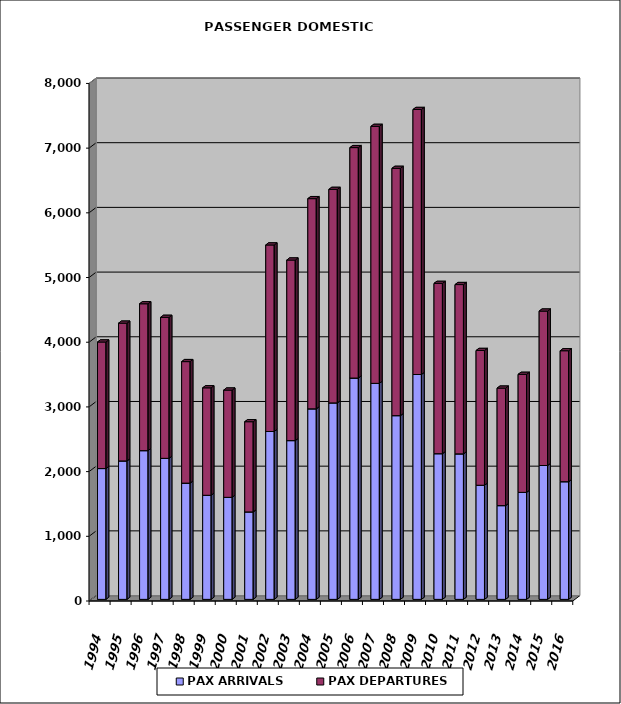
| Category | PAX ARRIVALS | PAX DEPARTURES |
|---|---|---|
| 1994.0 | 2022 | 1956 |
| 1995.0 | 2140 | 2129 |
| 1996.0 | 2299 | 2270 |
| 1997.0 | 2180 | 2179 |
| 1998.0 | 1797 | 1878 |
| 1999.0 | 1609 | 1661 |
| 2000.0 | 1577 | 1658 |
| 2001.0 | 1352 | 1394 |
| 2002.0 | 2595 | 2883 |
| 2003.0 | 2454 | 2791 |
| 2004.0 | 2945 | 3249 |
| 2005.0 | 3037 | 3300 |
| 2006.0 | 3421 | 3562 |
| 2007.0 | 3339 | 3972 |
| 2008.0 | 2840 | 3822 |
| 2009.0 | 3476 | 4096 |
| 2010.0 | 2252 | 2632 |
| 2011.0 | 2249 | 2617 |
| 2012.0 | 1764 | 2083 |
| 2013.0 | 1449 | 1816 |
| 2014.0 | 1654 | 1824 |
| 2015.0 | 2069 | 2387 |
| 2016.0 | 1819 | 2024 |